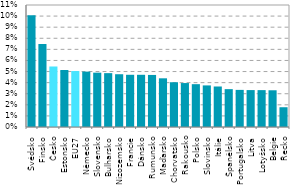
| Category | Series 0 |
|---|---|
| Švédsko | 0.101 |
| Finsko | 0.075 |
| Česko | 0.055 |
| Estonsko | 0.051 |
| EU27 | 0.05 |
| Německo | 0.05 |
| Slovensko | 0.049 |
| Bulharsko | 0.049 |
| Nizozemsko | 0.048 |
| Francie | 0.047 |
| Dánsko | 0.047 |
| Rumunsko | 0.047 |
| Maďarsko | 0.044 |
| Chorvatsko | 0.04 |
| Rakousko | 0.04 |
| Polsko | 0.039 |
| Slovinsko | 0.037 |
| Itálie | 0.037 |
| Španělsko | 0.034 |
| Portugalsko | 0.033 |
| Litva | 0.033 |
| Lotyšsko | 0.033 |
| Belgie | 0.033 |
| Řecko | 0.018 |